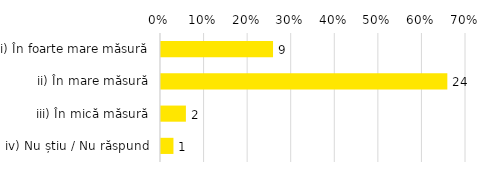
| Category | Total |
|---|---|
| i) În foarte mare măsură | 0.257 |
| ii) În mare măsură | 0.657 |
| iii) În mică măsură | 0.057 |
| iv) Nu știu / Nu răspund | 0.029 |